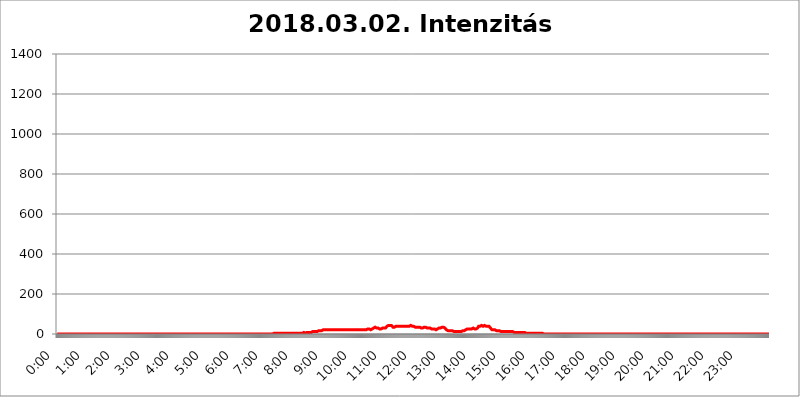
| Category | 2018.03.02. Intenzitás [W/m^2] |
|---|---|
| 0.0 | 0 |
| 0.0006944444444444445 | 0 |
| 0.001388888888888889 | 0 |
| 0.0020833333333333333 | 0 |
| 0.002777777777777778 | 0 |
| 0.003472222222222222 | 0 |
| 0.004166666666666667 | 0 |
| 0.004861111111111111 | 0 |
| 0.005555555555555556 | 0 |
| 0.0062499999999999995 | 0 |
| 0.006944444444444444 | 0 |
| 0.007638888888888889 | 0 |
| 0.008333333333333333 | 0 |
| 0.009027777777777779 | 0 |
| 0.009722222222222222 | 0 |
| 0.010416666666666666 | 0 |
| 0.011111111111111112 | 0 |
| 0.011805555555555555 | 0 |
| 0.012499999999999999 | 0 |
| 0.013194444444444444 | 0 |
| 0.013888888888888888 | 0 |
| 0.014583333333333332 | 0 |
| 0.015277777777777777 | 0 |
| 0.015972222222222224 | 0 |
| 0.016666666666666666 | 0 |
| 0.017361111111111112 | 0 |
| 0.018055555555555557 | 0 |
| 0.01875 | 0 |
| 0.019444444444444445 | 0 |
| 0.02013888888888889 | 0 |
| 0.020833333333333332 | 0 |
| 0.02152777777777778 | 0 |
| 0.022222222222222223 | 0 |
| 0.02291666666666667 | 0 |
| 0.02361111111111111 | 0 |
| 0.024305555555555556 | 0 |
| 0.024999999999999998 | 0 |
| 0.025694444444444447 | 0 |
| 0.02638888888888889 | 0 |
| 0.027083333333333334 | 0 |
| 0.027777777777777776 | 0 |
| 0.02847222222222222 | 0 |
| 0.029166666666666664 | 0 |
| 0.029861111111111113 | 0 |
| 0.030555555555555555 | 0 |
| 0.03125 | 0 |
| 0.03194444444444445 | 0 |
| 0.03263888888888889 | 0 |
| 0.03333333333333333 | 0 |
| 0.034027777777777775 | 0 |
| 0.034722222222222224 | 0 |
| 0.035416666666666666 | 0 |
| 0.036111111111111115 | 0 |
| 0.03680555555555556 | 0 |
| 0.0375 | 0 |
| 0.03819444444444444 | 0 |
| 0.03888888888888889 | 0 |
| 0.03958333333333333 | 0 |
| 0.04027777777777778 | 0 |
| 0.04097222222222222 | 0 |
| 0.041666666666666664 | 0 |
| 0.042361111111111106 | 0 |
| 0.04305555555555556 | 0 |
| 0.043750000000000004 | 0 |
| 0.044444444444444446 | 0 |
| 0.04513888888888889 | 0 |
| 0.04583333333333334 | 0 |
| 0.04652777777777778 | 0 |
| 0.04722222222222222 | 0 |
| 0.04791666666666666 | 0 |
| 0.04861111111111111 | 0 |
| 0.049305555555555554 | 0 |
| 0.049999999999999996 | 0 |
| 0.05069444444444445 | 0 |
| 0.051388888888888894 | 0 |
| 0.052083333333333336 | 0 |
| 0.05277777777777778 | 0 |
| 0.05347222222222222 | 0 |
| 0.05416666666666667 | 0 |
| 0.05486111111111111 | 0 |
| 0.05555555555555555 | 0 |
| 0.05625 | 0 |
| 0.05694444444444444 | 0 |
| 0.057638888888888885 | 0 |
| 0.05833333333333333 | 0 |
| 0.05902777777777778 | 0 |
| 0.059722222222222225 | 0 |
| 0.06041666666666667 | 0 |
| 0.061111111111111116 | 0 |
| 0.06180555555555556 | 0 |
| 0.0625 | 0 |
| 0.06319444444444444 | 0 |
| 0.06388888888888888 | 0 |
| 0.06458333333333334 | 0 |
| 0.06527777777777778 | 0 |
| 0.06597222222222222 | 0 |
| 0.06666666666666667 | 0 |
| 0.06736111111111111 | 0 |
| 0.06805555555555555 | 0 |
| 0.06874999999999999 | 0 |
| 0.06944444444444443 | 0 |
| 0.07013888888888889 | 0 |
| 0.07083333333333333 | 0 |
| 0.07152777777777779 | 0 |
| 0.07222222222222223 | 0 |
| 0.07291666666666667 | 0 |
| 0.07361111111111111 | 0 |
| 0.07430555555555556 | 0 |
| 0.075 | 0 |
| 0.07569444444444444 | 0 |
| 0.0763888888888889 | 0 |
| 0.07708333333333334 | 0 |
| 0.07777777777777778 | 0 |
| 0.07847222222222222 | 0 |
| 0.07916666666666666 | 0 |
| 0.0798611111111111 | 0 |
| 0.08055555555555556 | 0 |
| 0.08125 | 0 |
| 0.08194444444444444 | 0 |
| 0.08263888888888889 | 0 |
| 0.08333333333333333 | 0 |
| 0.08402777777777777 | 0 |
| 0.08472222222222221 | 0 |
| 0.08541666666666665 | 0 |
| 0.08611111111111112 | 0 |
| 0.08680555555555557 | 0 |
| 0.08750000000000001 | 0 |
| 0.08819444444444445 | 0 |
| 0.08888888888888889 | 0 |
| 0.08958333333333333 | 0 |
| 0.09027777777777778 | 0 |
| 0.09097222222222222 | 0 |
| 0.09166666666666667 | 0 |
| 0.09236111111111112 | 0 |
| 0.09305555555555556 | 0 |
| 0.09375 | 0 |
| 0.09444444444444444 | 0 |
| 0.09513888888888888 | 0 |
| 0.09583333333333333 | 0 |
| 0.09652777777777777 | 0 |
| 0.09722222222222222 | 0 |
| 0.09791666666666667 | 0 |
| 0.09861111111111111 | 0 |
| 0.09930555555555555 | 0 |
| 0.09999999999999999 | 0 |
| 0.10069444444444443 | 0 |
| 0.1013888888888889 | 0 |
| 0.10208333333333335 | 0 |
| 0.10277777777777779 | 0 |
| 0.10347222222222223 | 0 |
| 0.10416666666666667 | 0 |
| 0.10486111111111111 | 0 |
| 0.10555555555555556 | 0 |
| 0.10625 | 0 |
| 0.10694444444444444 | 0 |
| 0.1076388888888889 | 0 |
| 0.10833333333333334 | 0 |
| 0.10902777777777778 | 0 |
| 0.10972222222222222 | 0 |
| 0.1111111111111111 | 0 |
| 0.11180555555555556 | 0 |
| 0.11180555555555556 | 0 |
| 0.1125 | 0 |
| 0.11319444444444444 | 0 |
| 0.11388888888888889 | 0 |
| 0.11458333333333333 | 0 |
| 0.11527777777777777 | 0 |
| 0.11597222222222221 | 0 |
| 0.11666666666666665 | 0 |
| 0.1173611111111111 | 0 |
| 0.11805555555555557 | 0 |
| 0.11944444444444445 | 0 |
| 0.12013888888888889 | 0 |
| 0.12083333333333333 | 0 |
| 0.12152777777777778 | 0 |
| 0.12222222222222223 | 0 |
| 0.12291666666666667 | 0 |
| 0.12291666666666667 | 0 |
| 0.12361111111111112 | 0 |
| 0.12430555555555556 | 0 |
| 0.125 | 0 |
| 0.12569444444444444 | 0 |
| 0.12638888888888888 | 0 |
| 0.12708333333333333 | 0 |
| 0.16875 | 0 |
| 0.12847222222222224 | 0 |
| 0.12916666666666668 | 0 |
| 0.12986111111111112 | 0 |
| 0.13055555555555556 | 0 |
| 0.13125 | 0 |
| 0.13194444444444445 | 0 |
| 0.1326388888888889 | 0 |
| 0.13333333333333333 | 0 |
| 0.13402777777777777 | 0 |
| 0.13402777777777777 | 0 |
| 0.13472222222222222 | 0 |
| 0.13541666666666666 | 0 |
| 0.1361111111111111 | 0 |
| 0.13749999999999998 | 0 |
| 0.13819444444444443 | 0 |
| 0.1388888888888889 | 0 |
| 0.13958333333333334 | 0 |
| 0.14027777777777778 | 0 |
| 0.14097222222222222 | 0 |
| 0.14166666666666666 | 0 |
| 0.1423611111111111 | 0 |
| 0.14305555555555557 | 0 |
| 0.14375000000000002 | 0 |
| 0.14444444444444446 | 0 |
| 0.1451388888888889 | 0 |
| 0.1451388888888889 | 0 |
| 0.14652777777777778 | 0 |
| 0.14722222222222223 | 0 |
| 0.14791666666666667 | 0 |
| 0.1486111111111111 | 0 |
| 0.14930555555555555 | 0 |
| 0.15 | 0 |
| 0.15069444444444444 | 0 |
| 0.15138888888888888 | 0 |
| 0.15208333333333332 | 0 |
| 0.15277777777777776 | 0 |
| 0.15347222222222223 | 0 |
| 0.15416666666666667 | 0 |
| 0.15486111111111112 | 0 |
| 0.15555555555555556 | 0 |
| 0.15625 | 0 |
| 0.15694444444444444 | 0 |
| 0.15763888888888888 | 0 |
| 0.15833333333333333 | 0 |
| 0.15902777777777777 | 0 |
| 0.15972222222222224 | 0 |
| 0.16041666666666668 | 0 |
| 0.16111111111111112 | 0 |
| 0.16180555555555556 | 0 |
| 0.1625 | 0 |
| 0.16319444444444445 | 0 |
| 0.1638888888888889 | 0 |
| 0.16458333333333333 | 0 |
| 0.16527777777777777 | 0 |
| 0.16597222222222222 | 0 |
| 0.16666666666666666 | 0 |
| 0.1673611111111111 | 0 |
| 0.16805555555555554 | 0 |
| 0.16874999999999998 | 0 |
| 0.16944444444444443 | 0 |
| 0.17013888888888887 | 0 |
| 0.1708333333333333 | 0 |
| 0.17152777777777775 | 0 |
| 0.17222222222222225 | 0 |
| 0.1729166666666667 | 0 |
| 0.17361111111111113 | 0 |
| 0.17430555555555557 | 0 |
| 0.17500000000000002 | 0 |
| 0.17569444444444446 | 0 |
| 0.1763888888888889 | 0 |
| 0.17708333333333334 | 0 |
| 0.17777777777777778 | 0 |
| 0.17847222222222223 | 0 |
| 0.17916666666666667 | 0 |
| 0.1798611111111111 | 0 |
| 0.18055555555555555 | 0 |
| 0.18125 | 0 |
| 0.18194444444444444 | 0 |
| 0.1826388888888889 | 0 |
| 0.18333333333333335 | 0 |
| 0.1840277777777778 | 0 |
| 0.18472222222222223 | 0 |
| 0.18541666666666667 | 0 |
| 0.18611111111111112 | 0 |
| 0.18680555555555556 | 0 |
| 0.1875 | 0 |
| 0.18819444444444444 | 0 |
| 0.18888888888888888 | 0 |
| 0.18958333333333333 | 0 |
| 0.19027777777777777 | 0 |
| 0.1909722222222222 | 0 |
| 0.19166666666666665 | 0 |
| 0.19236111111111112 | 0 |
| 0.19305555555555554 | 0 |
| 0.19375 | 0 |
| 0.19444444444444445 | 0 |
| 0.1951388888888889 | 0 |
| 0.19583333333333333 | 0 |
| 0.19652777777777777 | 0 |
| 0.19722222222222222 | 0 |
| 0.19791666666666666 | 0 |
| 0.1986111111111111 | 0 |
| 0.19930555555555554 | 0 |
| 0.19999999999999998 | 0 |
| 0.20069444444444443 | 0 |
| 0.20138888888888887 | 0 |
| 0.2020833333333333 | 0 |
| 0.2027777777777778 | 0 |
| 0.2034722222222222 | 0 |
| 0.2041666666666667 | 0 |
| 0.20486111111111113 | 0 |
| 0.20555555555555557 | 0 |
| 0.20625000000000002 | 0 |
| 0.20694444444444446 | 0 |
| 0.2076388888888889 | 0 |
| 0.20833333333333334 | 0 |
| 0.20902777777777778 | 0 |
| 0.20972222222222223 | 0 |
| 0.21041666666666667 | 0 |
| 0.2111111111111111 | 0 |
| 0.21180555555555555 | 0 |
| 0.2125 | 0 |
| 0.21319444444444444 | 0 |
| 0.2138888888888889 | 0 |
| 0.21458333333333335 | 0 |
| 0.2152777777777778 | 0 |
| 0.21597222222222223 | 0 |
| 0.21666666666666667 | 0 |
| 0.21736111111111112 | 0 |
| 0.21805555555555556 | 0 |
| 0.21875 | 0 |
| 0.21944444444444444 | 0 |
| 0.22013888888888888 | 0 |
| 0.22083333333333333 | 0 |
| 0.22152777777777777 | 0 |
| 0.2222222222222222 | 0 |
| 0.22291666666666665 | 0 |
| 0.2236111111111111 | 0 |
| 0.22430555555555556 | 0 |
| 0.225 | 0 |
| 0.22569444444444445 | 0 |
| 0.2263888888888889 | 0 |
| 0.22708333333333333 | 0 |
| 0.22777777777777777 | 0 |
| 0.22847222222222222 | 0 |
| 0.22916666666666666 | 0 |
| 0.2298611111111111 | 0 |
| 0.23055555555555554 | 0 |
| 0.23124999999999998 | 0 |
| 0.23194444444444443 | 0 |
| 0.23263888888888887 | 0 |
| 0.2333333333333333 | 0 |
| 0.2340277777777778 | 0 |
| 0.2347222222222222 | 0 |
| 0.2354166666666667 | 0 |
| 0.23611111111111113 | 0 |
| 0.23680555555555557 | 0 |
| 0.23750000000000002 | 0 |
| 0.23819444444444446 | 0 |
| 0.2388888888888889 | 0 |
| 0.23958333333333334 | 0 |
| 0.24027777777777778 | 0 |
| 0.24097222222222223 | 0 |
| 0.24166666666666667 | 0 |
| 0.2423611111111111 | 0 |
| 0.24305555555555555 | 0 |
| 0.24375 | 0 |
| 0.24444444444444446 | 0 |
| 0.24513888888888888 | 0 |
| 0.24583333333333335 | 0 |
| 0.2465277777777778 | 0 |
| 0.24722222222222223 | 0 |
| 0.24791666666666667 | 0 |
| 0.24861111111111112 | 0 |
| 0.24930555555555556 | 0 |
| 0.25 | 0 |
| 0.25069444444444444 | 0 |
| 0.2513888888888889 | 0 |
| 0.2520833333333333 | 0 |
| 0.25277777777777777 | 0 |
| 0.2534722222222222 | 0 |
| 0.25416666666666665 | 0 |
| 0.2548611111111111 | 0 |
| 0.2555555555555556 | 0 |
| 0.25625000000000003 | 0 |
| 0.2569444444444445 | 0 |
| 0.2576388888888889 | 0 |
| 0.25833333333333336 | 0 |
| 0.2590277777777778 | 0 |
| 0.25972222222222224 | 0 |
| 0.2604166666666667 | 0 |
| 0.2611111111111111 | 0 |
| 0.26180555555555557 | 0 |
| 0.2625 | 0 |
| 0.26319444444444445 | 0 |
| 0.2638888888888889 | 0 |
| 0.26458333333333334 | 0 |
| 0.2652777777777778 | 0 |
| 0.2659722222222222 | 0 |
| 0.26666666666666666 | 0 |
| 0.2673611111111111 | 0 |
| 0.26805555555555555 | 0 |
| 0.26875 | 0 |
| 0.26944444444444443 | 0 |
| 0.2701388888888889 | 0 |
| 0.2708333333333333 | 0 |
| 0.27152777777777776 | 0 |
| 0.2722222222222222 | 0 |
| 0.27291666666666664 | 0 |
| 0.2736111111111111 | 0 |
| 0.2743055555555555 | 0 |
| 0.27499999999999997 | 0 |
| 0.27569444444444446 | 0 |
| 0.27638888888888885 | 0 |
| 0.27708333333333335 | 0 |
| 0.2777777777777778 | 0 |
| 0.27847222222222223 | 0 |
| 0.2791666666666667 | 0 |
| 0.2798611111111111 | 0 |
| 0.28055555555555556 | 0 |
| 0.28125 | 0 |
| 0.28194444444444444 | 0 |
| 0.2826388888888889 | 0 |
| 0.2833333333333333 | 0 |
| 0.28402777777777777 | 0 |
| 0.2847222222222222 | 0 |
| 0.28541666666666665 | 0 |
| 0.28611111111111115 | 0 |
| 0.28680555555555554 | 0 |
| 0.28750000000000003 | 0 |
| 0.2881944444444445 | 0 |
| 0.2888888888888889 | 0 |
| 0.28958333333333336 | 0 |
| 0.2902777777777778 | 0 |
| 0.29097222222222224 | 0 |
| 0.2916666666666667 | 0 |
| 0.2923611111111111 | 0 |
| 0.29305555555555557 | 0 |
| 0.29375 | 0 |
| 0.29444444444444445 | 0 |
| 0.2951388888888889 | 0 |
| 0.29583333333333334 | 0 |
| 0.2965277777777778 | 0 |
| 0.2972222222222222 | 0 |
| 0.29791666666666666 | 0 |
| 0.2986111111111111 | 0 |
| 0.29930555555555555 | 0 |
| 0.3 | 0 |
| 0.30069444444444443 | 0 |
| 0.3013888888888889 | 0 |
| 0.3020833333333333 | 0 |
| 0.30277777777777776 | 0 |
| 0.3034722222222222 | 0 |
| 0.30416666666666664 | 3.525 |
| 0.3048611111111111 | 0 |
| 0.3055555555555555 | 0 |
| 0.30624999999999997 | 3.525 |
| 0.3069444444444444 | 0 |
| 0.3076388888888889 | 3.525 |
| 0.30833333333333335 | 3.525 |
| 0.3090277777777778 | 3.525 |
| 0.30972222222222223 | 3.525 |
| 0.3104166666666667 | 3.525 |
| 0.3111111111111111 | 3.525 |
| 0.31180555555555556 | 3.525 |
| 0.3125 | 3.525 |
| 0.31319444444444444 | 3.525 |
| 0.3138888888888889 | 3.525 |
| 0.3145833333333333 | 3.525 |
| 0.31527777777777777 | 3.525 |
| 0.3159722222222222 | 3.525 |
| 0.31666666666666665 | 3.525 |
| 0.31736111111111115 | 3.525 |
| 0.31805555555555554 | 3.525 |
| 0.31875000000000003 | 3.525 |
| 0.3194444444444445 | 3.525 |
| 0.3201388888888889 | 3.525 |
| 0.32083333333333336 | 3.525 |
| 0.3215277777777778 | 3.525 |
| 0.32222222222222224 | 3.525 |
| 0.3229166666666667 | 3.525 |
| 0.3236111111111111 | 3.525 |
| 0.32430555555555557 | 3.525 |
| 0.325 | 3.525 |
| 0.32569444444444445 | 3.525 |
| 0.3263888888888889 | 3.525 |
| 0.32708333333333334 | 3.525 |
| 0.3277777777777778 | 3.525 |
| 0.3284722222222222 | 3.525 |
| 0.32916666666666666 | 3.525 |
| 0.3298611111111111 | 3.525 |
| 0.33055555555555555 | 3.525 |
| 0.33125 | 3.525 |
| 0.33194444444444443 | 3.525 |
| 0.3326388888888889 | 3.525 |
| 0.3333333333333333 | 3.525 |
| 0.3340277777777778 | 3.525 |
| 0.3347222222222222 | 3.525 |
| 0.3354166666666667 | 3.525 |
| 0.3361111111111111 | 3.525 |
| 0.3368055555555556 | 3.525 |
| 0.33749999999999997 | 3.525 |
| 0.33819444444444446 | 3.525 |
| 0.33888888888888885 | 7.887 |
| 0.33958333333333335 | 3.525 |
| 0.34027777777777773 | 3.525 |
| 0.34097222222222223 | 3.525 |
| 0.3416666666666666 | 3.525 |
| 0.3423611111111111 | 3.525 |
| 0.3430555555555555 | 3.525 |
| 0.34375 | 3.525 |
| 0.3444444444444445 | 7.887 |
| 0.3451388888888889 | 7.887 |
| 0.3458333333333334 | 7.887 |
| 0.34652777777777777 | 7.887 |
| 0.34722222222222227 | 7.887 |
| 0.34791666666666665 | 3.525 |
| 0.34861111111111115 | 7.887 |
| 0.34930555555555554 | 7.887 |
| 0.35000000000000003 | 7.887 |
| 0.3506944444444444 | 7.887 |
| 0.3513888888888889 | 7.887 |
| 0.3520833333333333 | 7.887 |
| 0.3527777777777778 | 7.887 |
| 0.3534722222222222 | 7.887 |
| 0.3541666666666667 | 7.887 |
| 0.3548611111111111 | 7.887 |
| 0.35555555555555557 | 7.887 |
| 0.35625 | 7.887 |
| 0.35694444444444445 | 7.887 |
| 0.3576388888888889 | 12.257 |
| 0.35833333333333334 | 12.257 |
| 0.3590277777777778 | 12.257 |
| 0.3597222222222222 | 12.257 |
| 0.36041666666666666 | 12.257 |
| 0.3611111111111111 | 12.257 |
| 0.36180555555555555 | 12.257 |
| 0.3625 | 12.257 |
| 0.36319444444444443 | 12.257 |
| 0.3638888888888889 | 12.257 |
| 0.3645833333333333 | 12.257 |
| 0.3652777777777778 | 12.257 |
| 0.3659722222222222 | 12.257 |
| 0.3666666666666667 | 16.636 |
| 0.3673611111111111 | 16.636 |
| 0.3680555555555556 | 16.636 |
| 0.36874999999999997 | 16.636 |
| 0.36944444444444446 | 16.636 |
| 0.37013888888888885 | 16.636 |
| 0.37083333333333335 | 16.636 |
| 0.37152777777777773 | 16.636 |
| 0.37222222222222223 | 21.024 |
| 0.3729166666666666 | 21.024 |
| 0.3736111111111111 | 21.024 |
| 0.3743055555555555 | 21.024 |
| 0.375 | 21.024 |
| 0.3756944444444445 | 21.024 |
| 0.3763888888888889 | 21.024 |
| 0.3770833333333334 | 21.024 |
| 0.37777777777777777 | 21.024 |
| 0.37847222222222227 | 25.419 |
| 0.37916666666666665 | 21.024 |
| 0.37986111111111115 | 21.024 |
| 0.38055555555555554 | 21.024 |
| 0.38125000000000003 | 21.024 |
| 0.3819444444444444 | 21.024 |
| 0.3826388888888889 | 21.024 |
| 0.3833333333333333 | 21.024 |
| 0.3840277777777778 | 21.024 |
| 0.3847222222222222 | 21.024 |
| 0.3854166666666667 | 21.024 |
| 0.3861111111111111 | 21.024 |
| 0.38680555555555557 | 21.024 |
| 0.3875 | 21.024 |
| 0.38819444444444445 | 21.024 |
| 0.3888888888888889 | 21.024 |
| 0.38958333333333334 | 21.024 |
| 0.3902777777777778 | 21.024 |
| 0.3909722222222222 | 21.024 |
| 0.39166666666666666 | 21.024 |
| 0.3923611111111111 | 21.024 |
| 0.39305555555555555 | 21.024 |
| 0.39375 | 21.024 |
| 0.39444444444444443 | 21.024 |
| 0.3951388888888889 | 21.024 |
| 0.3958333333333333 | 21.024 |
| 0.3965277777777778 | 21.024 |
| 0.3972222222222222 | 21.024 |
| 0.3979166666666667 | 21.024 |
| 0.3986111111111111 | 21.024 |
| 0.3993055555555556 | 21.024 |
| 0.39999999999999997 | 21.024 |
| 0.40069444444444446 | 21.024 |
| 0.40138888888888885 | 21.024 |
| 0.40208333333333335 | 21.024 |
| 0.40277777777777773 | 21.024 |
| 0.40347222222222223 | 21.024 |
| 0.4041666666666666 | 21.024 |
| 0.4048611111111111 | 21.024 |
| 0.4055555555555555 | 21.024 |
| 0.40625 | 21.024 |
| 0.4069444444444445 | 21.024 |
| 0.4076388888888889 | 21.024 |
| 0.4083333333333334 | 21.024 |
| 0.40902777777777777 | 21.024 |
| 0.40972222222222227 | 21.024 |
| 0.41041666666666665 | 21.024 |
| 0.41111111111111115 | 21.024 |
| 0.41180555555555554 | 21.024 |
| 0.41250000000000003 | 21.024 |
| 0.4131944444444444 | 21.024 |
| 0.4138888888888889 | 21.024 |
| 0.4145833333333333 | 21.024 |
| 0.4152777777777778 | 21.024 |
| 0.4159722222222222 | 21.024 |
| 0.4166666666666667 | 21.024 |
| 0.4173611111111111 | 21.024 |
| 0.41805555555555557 | 21.024 |
| 0.41875 | 21.024 |
| 0.41944444444444445 | 21.024 |
| 0.4201388888888889 | 21.024 |
| 0.42083333333333334 | 21.024 |
| 0.4215277777777778 | 21.024 |
| 0.4222222222222222 | 21.024 |
| 0.42291666666666666 | 21.024 |
| 0.4236111111111111 | 21.024 |
| 0.42430555555555555 | 21.024 |
| 0.425 | 21.024 |
| 0.42569444444444443 | 21.024 |
| 0.4263888888888889 | 21.024 |
| 0.4270833333333333 | 21.024 |
| 0.4277777777777778 | 21.024 |
| 0.4284722222222222 | 21.024 |
| 0.4291666666666667 | 21.024 |
| 0.4298611111111111 | 21.024 |
| 0.4305555555555556 | 21.024 |
| 0.43124999999999997 | 21.024 |
| 0.43194444444444446 | 21.024 |
| 0.43263888888888885 | 21.024 |
| 0.43333333333333335 | 21.024 |
| 0.43402777777777773 | 21.024 |
| 0.43472222222222223 | 25.419 |
| 0.4354166666666666 | 25.419 |
| 0.4361111111111111 | 25.419 |
| 0.4368055555555555 | 25.419 |
| 0.4375 | 25.419 |
| 0.4381944444444445 | 21.024 |
| 0.4388888888888889 | 25.419 |
| 0.4395833333333334 | 21.024 |
| 0.44027777777777777 | 25.419 |
| 0.44097222222222227 | 25.419 |
| 0.44166666666666665 | 25.419 |
| 0.44236111111111115 | 25.419 |
| 0.44305555555555554 | 29.823 |
| 0.44375000000000003 | 29.823 |
| 0.4444444444444444 | 29.823 |
| 0.4451388888888889 | 29.823 |
| 0.4458333333333333 | 34.234 |
| 0.4465277777777778 | 29.823 |
| 0.4472222222222222 | 29.823 |
| 0.4479166666666667 | 29.823 |
| 0.4486111111111111 | 29.823 |
| 0.44930555555555557 | 29.823 |
| 0.45 | 29.823 |
| 0.45069444444444445 | 29.823 |
| 0.4513888888888889 | 25.419 |
| 0.45208333333333334 | 25.419 |
| 0.4527777777777778 | 29.823 |
| 0.4534722222222222 | 29.823 |
| 0.45416666666666666 | 25.419 |
| 0.4548611111111111 | 29.823 |
| 0.45555555555555555 | 29.823 |
| 0.45625 | 29.823 |
| 0.45694444444444443 | 29.823 |
| 0.4576388888888889 | 29.823 |
| 0.4583333333333333 | 29.823 |
| 0.4590277777777778 | 34.234 |
| 0.4597222222222222 | 29.823 |
| 0.4604166666666667 | 29.823 |
| 0.4611111111111111 | 34.234 |
| 0.4618055555555556 | 34.234 |
| 0.46249999999999997 | 38.653 |
| 0.46319444444444446 | 38.653 |
| 0.46388888888888885 | 38.653 |
| 0.46458333333333335 | 43.079 |
| 0.46527777777777773 | 43.079 |
| 0.46597222222222223 | 43.079 |
| 0.4666666666666666 | 43.079 |
| 0.4673611111111111 | 43.079 |
| 0.4680555555555555 | 43.079 |
| 0.46875 | 43.079 |
| 0.4694444444444445 | 38.653 |
| 0.4701388888888889 | 38.653 |
| 0.4708333333333334 | 34.234 |
| 0.47152777777777777 | 34.234 |
| 0.47222222222222227 | 34.234 |
| 0.47291666666666665 | 34.234 |
| 0.47361111111111115 | 38.653 |
| 0.47430555555555554 | 38.653 |
| 0.47500000000000003 | 38.653 |
| 0.4756944444444444 | 38.653 |
| 0.4763888888888889 | 38.653 |
| 0.4770833333333333 | 38.653 |
| 0.4777777777777778 | 34.234 |
| 0.4784722222222222 | 38.653 |
| 0.4791666666666667 | 38.653 |
| 0.4798611111111111 | 38.653 |
| 0.48055555555555557 | 38.653 |
| 0.48125 | 38.653 |
| 0.48194444444444445 | 38.653 |
| 0.4826388888888889 | 38.653 |
| 0.48333333333333334 | 38.653 |
| 0.4840277777777778 | 38.653 |
| 0.4847222222222222 | 38.653 |
| 0.48541666666666666 | 38.653 |
| 0.4861111111111111 | 38.653 |
| 0.48680555555555555 | 38.653 |
| 0.4875 | 38.653 |
| 0.48819444444444443 | 38.653 |
| 0.4888888888888889 | 38.653 |
| 0.4895833333333333 | 38.653 |
| 0.4902777777777778 | 38.653 |
| 0.4909722222222222 | 38.653 |
| 0.4916666666666667 | 38.653 |
| 0.4923611111111111 | 38.653 |
| 0.4930555555555556 | 38.653 |
| 0.49374999999999997 | 38.653 |
| 0.49444444444444446 | 38.653 |
| 0.49513888888888885 | 38.653 |
| 0.49583333333333335 | 43.079 |
| 0.49652777777777773 | 43.079 |
| 0.49722222222222223 | 43.079 |
| 0.4979166666666666 | 38.653 |
| 0.4986111111111111 | 38.653 |
| 0.4993055555555555 | 38.653 |
| 0.5 | 38.653 |
| 0.5006944444444444 | 38.653 |
| 0.5013888888888889 | 34.234 |
| 0.5020833333333333 | 34.234 |
| 0.5027777777777778 | 34.234 |
| 0.5034722222222222 | 34.234 |
| 0.5041666666666667 | 34.234 |
| 0.5048611111111111 | 29.823 |
| 0.5055555555555555 | 29.823 |
| 0.50625 | 34.234 |
| 0.5069444444444444 | 34.234 |
| 0.5076388888888889 | 34.234 |
| 0.5083333333333333 | 34.234 |
| 0.5090277777777777 | 34.234 |
| 0.5097222222222222 | 34.234 |
| 0.5104166666666666 | 29.823 |
| 0.5111111111111112 | 29.823 |
| 0.5118055555555555 | 29.823 |
| 0.5125000000000001 | 29.823 |
| 0.5131944444444444 | 29.823 |
| 0.513888888888889 | 29.823 |
| 0.5145833333333333 | 34.234 |
| 0.5152777777777778 | 34.234 |
| 0.5159722222222222 | 34.234 |
| 0.5166666666666667 | 34.234 |
| 0.517361111111111 | 34.234 |
| 0.5180555555555556 | 34.234 |
| 0.5187499999999999 | 29.823 |
| 0.5194444444444445 | 29.823 |
| 0.5201388888888888 | 29.823 |
| 0.5208333333333334 | 29.823 |
| 0.5215277777777778 | 29.823 |
| 0.5222222222222223 | 29.823 |
| 0.5229166666666667 | 29.823 |
| 0.5236111111111111 | 29.823 |
| 0.5243055555555556 | 29.823 |
| 0.525 | 25.419 |
| 0.5256944444444445 | 25.419 |
| 0.5263888888888889 | 25.419 |
| 0.5270833333333333 | 25.419 |
| 0.5277777777777778 | 25.419 |
| 0.5284722222222222 | 25.419 |
| 0.5291666666666667 | 25.419 |
| 0.5298611111111111 | 25.419 |
| 0.5305555555555556 | 25.419 |
| 0.53125 | 21.024 |
| 0.5319444444444444 | 25.419 |
| 0.5326388888888889 | 25.419 |
| 0.5333333333333333 | 25.419 |
| 0.5340277777777778 | 29.823 |
| 0.5347222222222222 | 29.823 |
| 0.5354166666666667 | 29.823 |
| 0.5361111111111111 | 29.823 |
| 0.5368055555555555 | 29.823 |
| 0.5375 | 29.823 |
| 0.5381944444444444 | 34.234 |
| 0.5388888888888889 | 34.234 |
| 0.5395833333333333 | 34.234 |
| 0.5402777777777777 | 38.653 |
| 0.5409722222222222 | 38.653 |
| 0.5416666666666666 | 34.234 |
| 0.5423611111111112 | 34.234 |
| 0.5430555555555555 | 29.823 |
| 0.5437500000000001 | 29.823 |
| 0.5444444444444444 | 25.419 |
| 0.545138888888889 | 25.419 |
| 0.5458333333333333 | 21.024 |
| 0.5465277777777778 | 21.024 |
| 0.5472222222222222 | 16.636 |
| 0.5479166666666667 | 16.636 |
| 0.548611111111111 | 16.636 |
| 0.5493055555555556 | 16.636 |
| 0.5499999999999999 | 16.636 |
| 0.5506944444444445 | 16.636 |
| 0.5513888888888888 | 16.636 |
| 0.5520833333333334 | 16.636 |
| 0.5527777777777778 | 16.636 |
| 0.5534722222222223 | 16.636 |
| 0.5541666666666667 | 16.636 |
| 0.5548611111111111 | 12.257 |
| 0.5555555555555556 | 12.257 |
| 0.55625 | 12.257 |
| 0.5569444444444445 | 12.257 |
| 0.5576388888888889 | 12.257 |
| 0.5583333333333333 | 12.257 |
| 0.5590277777777778 | 12.257 |
| 0.5597222222222222 | 12.257 |
| 0.5604166666666667 | 12.257 |
| 0.5611111111111111 | 12.257 |
| 0.5618055555555556 | 12.257 |
| 0.5625 | 12.257 |
| 0.5631944444444444 | 12.257 |
| 0.5638888888888889 | 12.257 |
| 0.5645833333333333 | 12.257 |
| 0.5652777777777778 | 12.257 |
| 0.5659722222222222 | 12.257 |
| 0.5666666666666667 | 12.257 |
| 0.5673611111111111 | 12.257 |
| 0.5680555555555555 | 12.257 |
| 0.56875 | 16.636 |
| 0.5694444444444444 | 16.636 |
| 0.5701388888888889 | 16.636 |
| 0.5708333333333333 | 16.636 |
| 0.5715277777777777 | 16.636 |
| 0.5722222222222222 | 21.024 |
| 0.5729166666666666 | 21.024 |
| 0.5736111111111112 | 25.419 |
| 0.5743055555555555 | 21.024 |
| 0.5750000000000001 | 25.419 |
| 0.5756944444444444 | 25.419 |
| 0.576388888888889 | 25.419 |
| 0.5770833333333333 | 25.419 |
| 0.5777777777777778 | 25.419 |
| 0.5784722222222222 | 25.419 |
| 0.5791666666666667 | 25.419 |
| 0.579861111111111 | 25.419 |
| 0.5805555555555556 | 25.419 |
| 0.5812499999999999 | 25.419 |
| 0.5819444444444445 | 29.823 |
| 0.5826388888888888 | 29.823 |
| 0.5833333333333334 | 29.823 |
| 0.5840277777777778 | 25.419 |
| 0.5847222222222223 | 25.419 |
| 0.5854166666666667 | 25.419 |
| 0.5861111111111111 | 21.024 |
| 0.5868055555555556 | 21.024 |
| 0.5875 | 25.419 |
| 0.5881944444444445 | 25.419 |
| 0.5888888888888889 | 29.823 |
| 0.5895833333333333 | 29.823 |
| 0.5902777777777778 | 34.234 |
| 0.5909722222222222 | 38.653 |
| 0.5916666666666667 | 38.653 |
| 0.5923611111111111 | 38.653 |
| 0.5930555555555556 | 38.653 |
| 0.59375 | 38.653 |
| 0.5944444444444444 | 43.079 |
| 0.5951388888888889 | 43.079 |
| 0.5958333333333333 | 38.653 |
| 0.5965277777777778 | 38.653 |
| 0.5972222222222222 | 38.653 |
| 0.5979166666666667 | 38.653 |
| 0.5986111111111111 | 38.653 |
| 0.5993055555555555 | 43.079 |
| 0.6 | 43.079 |
| 0.6006944444444444 | 43.079 |
| 0.6013888888888889 | 38.653 |
| 0.6020833333333333 | 38.653 |
| 0.6027777777777777 | 38.653 |
| 0.6034722222222222 | 38.653 |
| 0.6041666666666666 | 34.234 |
| 0.6048611111111112 | 38.653 |
| 0.6055555555555555 | 38.653 |
| 0.6062500000000001 | 38.653 |
| 0.6069444444444444 | 34.234 |
| 0.607638888888889 | 29.823 |
| 0.6083333333333333 | 29.823 |
| 0.6090277777777778 | 25.419 |
| 0.6097222222222222 | 21.024 |
| 0.6104166666666667 | 21.024 |
| 0.611111111111111 | 21.024 |
| 0.6118055555555556 | 21.024 |
| 0.6124999999999999 | 21.024 |
| 0.6131944444444445 | 21.024 |
| 0.6138888888888888 | 21.024 |
| 0.6145833333333334 | 16.636 |
| 0.6152777777777778 | 16.636 |
| 0.6159722222222223 | 16.636 |
| 0.6166666666666667 | 16.636 |
| 0.6173611111111111 | 16.636 |
| 0.6180555555555556 | 16.636 |
| 0.61875 | 16.636 |
| 0.6194444444444445 | 16.636 |
| 0.6201388888888889 | 16.636 |
| 0.6208333333333333 | 12.257 |
| 0.6215277777777778 | 12.257 |
| 0.6222222222222222 | 12.257 |
| 0.6229166666666667 | 12.257 |
| 0.6236111111111111 | 12.257 |
| 0.6243055555555556 | 12.257 |
| 0.625 | 12.257 |
| 0.6256944444444444 | 12.257 |
| 0.6263888888888889 | 12.257 |
| 0.6270833333333333 | 12.257 |
| 0.6277777777777778 | 12.257 |
| 0.6284722222222222 | 12.257 |
| 0.6291666666666667 | 12.257 |
| 0.6298611111111111 | 12.257 |
| 0.6305555555555555 | 12.257 |
| 0.63125 | 12.257 |
| 0.6319444444444444 | 12.257 |
| 0.6326388888888889 | 12.257 |
| 0.6333333333333333 | 12.257 |
| 0.6340277777777777 | 12.257 |
| 0.6347222222222222 | 12.257 |
| 0.6354166666666666 | 12.257 |
| 0.6361111111111112 | 12.257 |
| 0.6368055555555555 | 12.257 |
| 0.6375000000000001 | 12.257 |
| 0.6381944444444444 | 12.257 |
| 0.638888888888889 | 12.257 |
| 0.6395833333333333 | 12.257 |
| 0.6402777777777778 | 7.887 |
| 0.6409722222222222 | 7.887 |
| 0.6416666666666667 | 7.887 |
| 0.642361111111111 | 7.887 |
| 0.6430555555555556 | 7.887 |
| 0.6437499999999999 | 7.887 |
| 0.6444444444444445 | 7.887 |
| 0.6451388888888888 | 7.887 |
| 0.6458333333333334 | 7.887 |
| 0.6465277777777778 | 7.887 |
| 0.6472222222222223 | 7.887 |
| 0.6479166666666667 | 7.887 |
| 0.6486111111111111 | 7.887 |
| 0.6493055555555556 | 7.887 |
| 0.65 | 7.887 |
| 0.6506944444444445 | 7.887 |
| 0.6513888888888889 | 7.887 |
| 0.6520833333333333 | 7.887 |
| 0.6527777777777778 | 7.887 |
| 0.6534722222222222 | 7.887 |
| 0.6541666666666667 | 7.887 |
| 0.6548611111111111 | 7.887 |
| 0.6555555555555556 | 7.887 |
| 0.65625 | 7.887 |
| 0.6569444444444444 | 7.887 |
| 0.6576388888888889 | 3.525 |
| 0.6583333333333333 | 3.525 |
| 0.6590277777777778 | 3.525 |
| 0.6597222222222222 | 3.525 |
| 0.6604166666666667 | 3.525 |
| 0.6611111111111111 | 3.525 |
| 0.6618055555555555 | 3.525 |
| 0.6625 | 3.525 |
| 0.6631944444444444 | 3.525 |
| 0.6638888888888889 | 3.525 |
| 0.6645833333333333 | 3.525 |
| 0.6652777777777777 | 3.525 |
| 0.6659722222222222 | 3.525 |
| 0.6666666666666666 | 3.525 |
| 0.6673611111111111 | 3.525 |
| 0.6680555555555556 | 3.525 |
| 0.6687500000000001 | 3.525 |
| 0.6694444444444444 | 3.525 |
| 0.6701388888888888 | 3.525 |
| 0.6708333333333334 | 3.525 |
| 0.6715277777777778 | 3.525 |
| 0.6722222222222222 | 3.525 |
| 0.6729166666666666 | 3.525 |
| 0.6736111111111112 | 3.525 |
| 0.6743055555555556 | 3.525 |
| 0.6749999999999999 | 3.525 |
| 0.6756944444444444 | 3.525 |
| 0.6763888888888889 | 3.525 |
| 0.6770833333333334 | 3.525 |
| 0.6777777777777777 | 3.525 |
| 0.6784722222222223 | 3.525 |
| 0.6791666666666667 | 3.525 |
| 0.6798611111111111 | 3.525 |
| 0.6805555555555555 | 3.525 |
| 0.68125 | 3.525 |
| 0.6819444444444445 | 0 |
| 0.6826388888888889 | 0 |
| 0.6833333333333332 | 0 |
| 0.6840277777777778 | 0 |
| 0.6847222222222222 | 0 |
| 0.6854166666666667 | 0 |
| 0.686111111111111 | 0 |
| 0.6868055555555556 | 0 |
| 0.6875 | 0 |
| 0.6881944444444444 | 0 |
| 0.688888888888889 | 0 |
| 0.6895833333333333 | 0 |
| 0.6902777777777778 | 0 |
| 0.6909722222222222 | 0 |
| 0.6916666666666668 | 0 |
| 0.6923611111111111 | 0 |
| 0.6930555555555555 | 0 |
| 0.69375 | 0 |
| 0.6944444444444445 | 0 |
| 0.6951388888888889 | 0 |
| 0.6958333333333333 | 0 |
| 0.6965277777777777 | 0 |
| 0.6972222222222223 | 0 |
| 0.6979166666666666 | 0 |
| 0.6986111111111111 | 0 |
| 0.6993055555555556 | 0 |
| 0.7000000000000001 | 0 |
| 0.7006944444444444 | 0 |
| 0.7013888888888888 | 0 |
| 0.7020833333333334 | 0 |
| 0.7027777777777778 | 0 |
| 0.7034722222222222 | 0 |
| 0.7041666666666666 | 0 |
| 0.7048611111111112 | 0 |
| 0.7055555555555556 | 0 |
| 0.7062499999999999 | 0 |
| 0.7069444444444444 | 0 |
| 0.7076388888888889 | 0 |
| 0.7083333333333334 | 0 |
| 0.7090277777777777 | 0 |
| 0.7097222222222223 | 0 |
| 0.7104166666666667 | 0 |
| 0.7111111111111111 | 0 |
| 0.7118055555555555 | 0 |
| 0.7125 | 0 |
| 0.7131944444444445 | 0 |
| 0.7138888888888889 | 0 |
| 0.7145833333333332 | 0 |
| 0.7152777777777778 | 0 |
| 0.7159722222222222 | 0 |
| 0.7166666666666667 | 0 |
| 0.717361111111111 | 0 |
| 0.7180555555555556 | 0 |
| 0.71875 | 0 |
| 0.7194444444444444 | 0 |
| 0.720138888888889 | 0 |
| 0.7208333333333333 | 0 |
| 0.7215277777777778 | 0 |
| 0.7222222222222222 | 0 |
| 0.7229166666666668 | 0 |
| 0.7236111111111111 | 0 |
| 0.7243055555555555 | 0 |
| 0.725 | 0 |
| 0.7256944444444445 | 0 |
| 0.7263888888888889 | 0 |
| 0.7270833333333333 | 0 |
| 0.7277777777777777 | 0 |
| 0.7284722222222223 | 0 |
| 0.7291666666666666 | 0 |
| 0.7298611111111111 | 0 |
| 0.7305555555555556 | 0 |
| 0.7312500000000001 | 0 |
| 0.7319444444444444 | 0 |
| 0.7326388888888888 | 0 |
| 0.7333333333333334 | 0 |
| 0.7340277777777778 | 0 |
| 0.7347222222222222 | 0 |
| 0.7354166666666666 | 0 |
| 0.7361111111111112 | 0 |
| 0.7368055555555556 | 0 |
| 0.7374999999999999 | 0 |
| 0.7381944444444444 | 0 |
| 0.7388888888888889 | 0 |
| 0.7395833333333334 | 0 |
| 0.7402777777777777 | 0 |
| 0.7409722222222223 | 0 |
| 0.7416666666666667 | 0 |
| 0.7423611111111111 | 0 |
| 0.7430555555555555 | 0 |
| 0.74375 | 0 |
| 0.7444444444444445 | 0 |
| 0.7451388888888889 | 0 |
| 0.7458333333333332 | 0 |
| 0.7465277777777778 | 0 |
| 0.7472222222222222 | 0 |
| 0.7479166666666667 | 0 |
| 0.748611111111111 | 0 |
| 0.7493055555555556 | 0 |
| 0.75 | 0 |
| 0.7506944444444444 | 0 |
| 0.751388888888889 | 0 |
| 0.7520833333333333 | 0 |
| 0.7527777777777778 | 0 |
| 0.7534722222222222 | 0 |
| 0.7541666666666668 | 0 |
| 0.7548611111111111 | 0 |
| 0.7555555555555555 | 0 |
| 0.75625 | 0 |
| 0.7569444444444445 | 0 |
| 0.7576388888888889 | 0 |
| 0.7583333333333333 | 0 |
| 0.7590277777777777 | 0 |
| 0.7597222222222223 | 0 |
| 0.7604166666666666 | 0 |
| 0.7611111111111111 | 0 |
| 0.7618055555555556 | 0 |
| 0.7625000000000001 | 0 |
| 0.7631944444444444 | 0 |
| 0.7638888888888888 | 0 |
| 0.7645833333333334 | 0 |
| 0.7652777777777778 | 0 |
| 0.7659722222222222 | 0 |
| 0.7666666666666666 | 0 |
| 0.7673611111111112 | 0 |
| 0.7680555555555556 | 0 |
| 0.7687499999999999 | 0 |
| 0.7694444444444444 | 0 |
| 0.7701388888888889 | 0 |
| 0.7708333333333334 | 0 |
| 0.7715277777777777 | 0 |
| 0.7722222222222223 | 0 |
| 0.7729166666666667 | 0 |
| 0.7736111111111111 | 0 |
| 0.7743055555555555 | 0 |
| 0.775 | 0 |
| 0.7756944444444445 | 0 |
| 0.7763888888888889 | 0 |
| 0.7770833333333332 | 0 |
| 0.7777777777777778 | 0 |
| 0.7784722222222222 | 0 |
| 0.7791666666666667 | 0 |
| 0.779861111111111 | 0 |
| 0.7805555555555556 | 0 |
| 0.78125 | 0 |
| 0.7819444444444444 | 0 |
| 0.782638888888889 | 0 |
| 0.7833333333333333 | 0 |
| 0.7840277777777778 | 0 |
| 0.7847222222222222 | 0 |
| 0.7854166666666668 | 0 |
| 0.7861111111111111 | 0 |
| 0.7868055555555555 | 0 |
| 0.7875 | 0 |
| 0.7881944444444445 | 0 |
| 0.7888888888888889 | 0 |
| 0.7895833333333333 | 0 |
| 0.7902777777777777 | 0 |
| 0.7909722222222223 | 0 |
| 0.7916666666666666 | 0 |
| 0.7923611111111111 | 0 |
| 0.7930555555555556 | 0 |
| 0.7937500000000001 | 0 |
| 0.7944444444444444 | 0 |
| 0.7951388888888888 | 0 |
| 0.7958333333333334 | 0 |
| 0.7965277777777778 | 0 |
| 0.7972222222222222 | 0 |
| 0.7979166666666666 | 0 |
| 0.7986111111111112 | 0 |
| 0.7993055555555556 | 0 |
| 0.7999999999999999 | 0 |
| 0.8006944444444444 | 0 |
| 0.8013888888888889 | 0 |
| 0.8020833333333334 | 0 |
| 0.8027777777777777 | 0 |
| 0.8034722222222223 | 0 |
| 0.8041666666666667 | 0 |
| 0.8048611111111111 | 0 |
| 0.8055555555555555 | 0 |
| 0.80625 | 0 |
| 0.8069444444444445 | 0 |
| 0.8076388888888889 | 0 |
| 0.8083333333333332 | 0 |
| 0.8090277777777778 | 0 |
| 0.8097222222222222 | 0 |
| 0.8104166666666667 | 0 |
| 0.811111111111111 | 0 |
| 0.8118055555555556 | 0 |
| 0.8125 | 0 |
| 0.8131944444444444 | 0 |
| 0.813888888888889 | 0 |
| 0.8145833333333333 | 0 |
| 0.8152777777777778 | 0 |
| 0.8159722222222222 | 0 |
| 0.8166666666666668 | 0 |
| 0.8173611111111111 | 0 |
| 0.8180555555555555 | 0 |
| 0.81875 | 0 |
| 0.8194444444444445 | 0 |
| 0.8201388888888889 | 0 |
| 0.8208333333333333 | 0 |
| 0.8215277777777777 | 0 |
| 0.8222222222222223 | 0 |
| 0.8229166666666666 | 0 |
| 0.8236111111111111 | 0 |
| 0.8243055555555556 | 0 |
| 0.8250000000000001 | 0 |
| 0.8256944444444444 | 0 |
| 0.8263888888888888 | 0 |
| 0.8270833333333334 | 0 |
| 0.8277777777777778 | 0 |
| 0.8284722222222222 | 0 |
| 0.8291666666666666 | 0 |
| 0.8298611111111112 | 0 |
| 0.8305555555555556 | 0 |
| 0.8312499999999999 | 0 |
| 0.8319444444444444 | 0 |
| 0.8326388888888889 | 0 |
| 0.8333333333333334 | 0 |
| 0.8340277777777777 | 0 |
| 0.8347222222222223 | 0 |
| 0.8354166666666667 | 0 |
| 0.8361111111111111 | 0 |
| 0.8368055555555555 | 0 |
| 0.8375 | 0 |
| 0.8381944444444445 | 0 |
| 0.8388888888888889 | 0 |
| 0.8395833333333332 | 0 |
| 0.8402777777777778 | 0 |
| 0.8409722222222222 | 0 |
| 0.8416666666666667 | 0 |
| 0.842361111111111 | 0 |
| 0.8430555555555556 | 0 |
| 0.84375 | 0 |
| 0.8444444444444444 | 0 |
| 0.845138888888889 | 0 |
| 0.8458333333333333 | 0 |
| 0.8465277777777778 | 0 |
| 0.8472222222222222 | 0 |
| 0.8479166666666668 | 0 |
| 0.8486111111111111 | 0 |
| 0.8493055555555555 | 0 |
| 0.85 | 0 |
| 0.8506944444444445 | 0 |
| 0.8513888888888889 | 0 |
| 0.8520833333333333 | 0 |
| 0.8527777777777777 | 0 |
| 0.8534722222222223 | 0 |
| 0.8541666666666666 | 0 |
| 0.8548611111111111 | 0 |
| 0.8555555555555556 | 0 |
| 0.8562500000000001 | 0 |
| 0.8569444444444444 | 0 |
| 0.8576388888888888 | 0 |
| 0.8583333333333334 | 0 |
| 0.8590277777777778 | 0 |
| 0.8597222222222222 | 0 |
| 0.8604166666666666 | 0 |
| 0.8611111111111112 | 0 |
| 0.8618055555555556 | 0 |
| 0.8624999999999999 | 0 |
| 0.8631944444444444 | 0 |
| 0.8638888888888889 | 0 |
| 0.8645833333333334 | 0 |
| 0.8652777777777777 | 0 |
| 0.8659722222222223 | 0 |
| 0.8666666666666667 | 0 |
| 0.8673611111111111 | 0 |
| 0.8680555555555555 | 0 |
| 0.86875 | 0 |
| 0.8694444444444445 | 0 |
| 0.8701388888888889 | 0 |
| 0.8708333333333332 | 0 |
| 0.8715277777777778 | 0 |
| 0.8722222222222222 | 0 |
| 0.8729166666666667 | 0 |
| 0.873611111111111 | 0 |
| 0.8743055555555556 | 0 |
| 0.875 | 0 |
| 0.8756944444444444 | 0 |
| 0.876388888888889 | 0 |
| 0.8770833333333333 | 0 |
| 0.8777777777777778 | 0 |
| 0.8784722222222222 | 0 |
| 0.8791666666666668 | 0 |
| 0.8798611111111111 | 0 |
| 0.8805555555555555 | 0 |
| 0.88125 | 0 |
| 0.8819444444444445 | 0 |
| 0.8826388888888889 | 0 |
| 0.8833333333333333 | 0 |
| 0.8840277777777777 | 0 |
| 0.8847222222222223 | 0 |
| 0.8854166666666666 | 0 |
| 0.8861111111111111 | 0 |
| 0.8868055555555556 | 0 |
| 0.8875000000000001 | 0 |
| 0.8881944444444444 | 0 |
| 0.8888888888888888 | 0 |
| 0.8895833333333334 | 0 |
| 0.8902777777777778 | 0 |
| 0.8909722222222222 | 0 |
| 0.8916666666666666 | 0 |
| 0.8923611111111112 | 0 |
| 0.8930555555555556 | 0 |
| 0.8937499999999999 | 0 |
| 0.8944444444444444 | 0 |
| 0.8951388888888889 | 0 |
| 0.8958333333333334 | 0 |
| 0.8965277777777777 | 0 |
| 0.8972222222222223 | 0 |
| 0.8979166666666667 | 0 |
| 0.8986111111111111 | 0 |
| 0.8993055555555555 | 0 |
| 0.9 | 0 |
| 0.9006944444444445 | 0 |
| 0.9013888888888889 | 0 |
| 0.9020833333333332 | 0 |
| 0.9027777777777778 | 0 |
| 0.9034722222222222 | 0 |
| 0.9041666666666667 | 0 |
| 0.904861111111111 | 0 |
| 0.9055555555555556 | 0 |
| 0.90625 | 0 |
| 0.9069444444444444 | 0 |
| 0.907638888888889 | 0 |
| 0.9083333333333333 | 0 |
| 0.9090277777777778 | 0 |
| 0.9097222222222222 | 0 |
| 0.9104166666666668 | 0 |
| 0.9111111111111111 | 0 |
| 0.9118055555555555 | 0 |
| 0.9125 | 0 |
| 0.9131944444444445 | 0 |
| 0.9138888888888889 | 0 |
| 0.9145833333333333 | 0 |
| 0.9152777777777777 | 0 |
| 0.9159722222222223 | 0 |
| 0.9166666666666666 | 0 |
| 0.9173611111111111 | 0 |
| 0.9180555555555556 | 0 |
| 0.9187500000000001 | 0 |
| 0.9194444444444444 | 0 |
| 0.9201388888888888 | 0 |
| 0.9208333333333334 | 0 |
| 0.9215277777777778 | 0 |
| 0.9222222222222222 | 0 |
| 0.9229166666666666 | 0 |
| 0.9236111111111112 | 0 |
| 0.9243055555555556 | 0 |
| 0.9249999999999999 | 0 |
| 0.9256944444444444 | 0 |
| 0.9263888888888889 | 0 |
| 0.9270833333333334 | 0 |
| 0.9277777777777777 | 0 |
| 0.9284722222222223 | 0 |
| 0.9291666666666667 | 0 |
| 0.9298611111111111 | 0 |
| 0.9305555555555555 | 0 |
| 0.93125 | 0 |
| 0.9319444444444445 | 0 |
| 0.9326388888888889 | 0 |
| 0.9333333333333332 | 0 |
| 0.9340277777777778 | 0 |
| 0.9347222222222222 | 0 |
| 0.9354166666666667 | 0 |
| 0.936111111111111 | 0 |
| 0.9368055555555556 | 0 |
| 0.9375 | 0 |
| 0.9381944444444444 | 0 |
| 0.938888888888889 | 0 |
| 0.9395833333333333 | 0 |
| 0.9402777777777778 | 0 |
| 0.9409722222222222 | 0 |
| 0.9416666666666668 | 0 |
| 0.9423611111111111 | 0 |
| 0.9430555555555555 | 0 |
| 0.94375 | 0 |
| 0.9444444444444445 | 0 |
| 0.9451388888888889 | 0 |
| 0.9458333333333333 | 0 |
| 0.9465277777777777 | 0 |
| 0.9472222222222223 | 0 |
| 0.9479166666666666 | 0 |
| 0.9486111111111111 | 0 |
| 0.9493055555555556 | 0 |
| 0.9500000000000001 | 0 |
| 0.9506944444444444 | 0 |
| 0.9513888888888888 | 0 |
| 0.9520833333333334 | 0 |
| 0.9527777777777778 | 0 |
| 0.9534722222222222 | 0 |
| 0.9541666666666666 | 0 |
| 0.9548611111111112 | 0 |
| 0.9555555555555556 | 0 |
| 0.9562499999999999 | 0 |
| 0.9569444444444444 | 0 |
| 0.9576388888888889 | 0 |
| 0.9583333333333334 | 0 |
| 0.9590277777777777 | 0 |
| 0.9597222222222223 | 0 |
| 0.9604166666666667 | 0 |
| 0.9611111111111111 | 0 |
| 0.9618055555555555 | 0 |
| 0.9625 | 0 |
| 0.9631944444444445 | 0 |
| 0.9638888888888889 | 0 |
| 0.9645833333333332 | 0 |
| 0.9652777777777778 | 0 |
| 0.9659722222222222 | 0 |
| 0.9666666666666667 | 0 |
| 0.967361111111111 | 0 |
| 0.9680555555555556 | 0 |
| 0.96875 | 0 |
| 0.9694444444444444 | 0 |
| 0.970138888888889 | 0 |
| 0.9708333333333333 | 0 |
| 0.9715277777777778 | 0 |
| 0.9722222222222222 | 0 |
| 0.9729166666666668 | 0 |
| 0.9736111111111111 | 0 |
| 0.9743055555555555 | 0 |
| 0.975 | 0 |
| 0.9756944444444445 | 0 |
| 0.9763888888888889 | 0 |
| 0.9770833333333333 | 0 |
| 0.9777777777777777 | 0 |
| 0.9784722222222223 | 0 |
| 0.9791666666666666 | 0 |
| 0.9798611111111111 | 0 |
| 0.9805555555555556 | 0 |
| 0.9812500000000001 | 0 |
| 0.9819444444444444 | 0 |
| 0.9826388888888888 | 0 |
| 0.9833333333333334 | 0 |
| 0.9840277777777778 | 0 |
| 0.9847222222222222 | 0 |
| 0.9854166666666666 | 0 |
| 0.9861111111111112 | 0 |
| 0.9868055555555556 | 0 |
| 0.9874999999999999 | 0 |
| 0.9881944444444444 | 0 |
| 0.9888888888888889 | 0 |
| 0.9895833333333334 | 0 |
| 0.9902777777777777 | 0 |
| 0.9909722222222223 | 0 |
| 0.9916666666666667 | 0 |
| 0.9923611111111111 | 0 |
| 0.9930555555555555 | 0 |
| 0.99375 | 0 |
| 0.9944444444444445 | 0 |
| 0.9951388888888889 | 0 |
| 0.9958333333333332 | 0 |
| 0.9965277777777778 | 0 |
| 0.9972222222222222 | 0 |
| 0.9979166666666667 | 0 |
| 0.998611111111111 | 0 |
| 0.9993055555555556 | 0 |